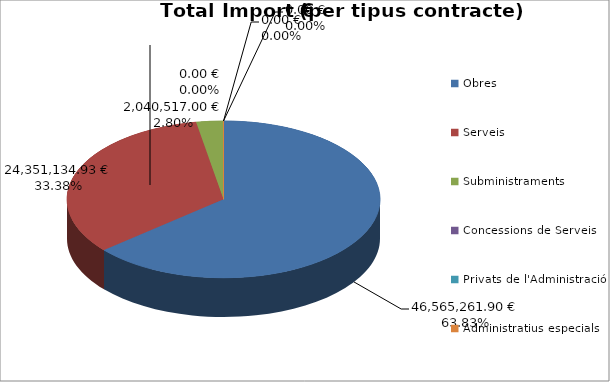
| Category | Total preu              (amb iva) |
|---|---|
| Obres | 46565261.902 |
| Serveis | 24351134.927 |
| Subministraments | 2040516.997 |
| Concessions de Serveis | 0 |
| Privats de l'Administració | 0 |
| Administratius especials | 0.001 |